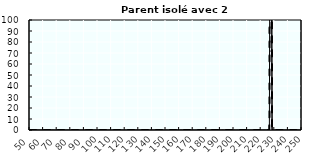
| Category | Coin fiscal marginal (somme des composantes) | Taux d’imposition marginal net |
|---|---|---|
| 50.0 | 0 | 0 |
| 51.0 | 0 | 0 |
| 52.0 | 0 | 0 |
| 53.0 | 0 | 0 |
| 54.0 | 0 | 0 |
| 55.0 | 0 | 0 |
| 56.0 | 0 | 0 |
| 57.0 | 0 | 0 |
| 58.0 | 0 | 0 |
| 59.0 | 0 | 0 |
| 60.0 | 0 | 0 |
| 61.0 | 0 | 0 |
| 62.0 | 0 | 0 |
| 63.0 | 0 | 0 |
| 64.0 | 0 | 0 |
| 65.0 | 0 | 0 |
| 66.0 | 0 | 0 |
| 67.0 | 0 | 0 |
| 68.0 | 0 | 0 |
| 69.0 | 0 | 0 |
| 70.0 | 0 | 0 |
| 71.0 | 0 | 0 |
| 72.0 | 0 | 0 |
| 73.0 | 0 | 0 |
| 74.0 | 0 | 0 |
| 75.0 | 0 | 0 |
| 76.0 | 0 | 0 |
| 77.0 | 0 | 0 |
| 78.0 | 0 | 0 |
| 79.0 | 0 | 0 |
| 80.0 | 0 | 0 |
| 81.0 | 0 | 0 |
| 82.0 | 0 | 0 |
| 83.0 | 0 | 0 |
| 84.0 | 0 | 0 |
| 85.0 | 0 | 0 |
| 86.0 | 0 | 0 |
| 87.0 | 0 | 0 |
| 88.0 | 0 | 0 |
| 89.0 | 0 | 0 |
| 90.0 | 0 | 0 |
| 91.0 | 0 | 0 |
| 92.0 | 0 | 0 |
| 93.0 | 0 | 0 |
| 94.0 | 0 | 0 |
| 95.0 | 0 | 0 |
| 96.0 | 0 | 0 |
| 97.0 | 0 | 0 |
| 98.0 | 0 | 0 |
| 99.0 | 0 | 0 |
| 100.0 | 0 | 0 |
| 101.0 | 0 | 0 |
| 102.0 | 0 | 0 |
| 103.0 | 0 | 0 |
| 104.0 | 0 | 0 |
| 105.0 | 0 | 0 |
| 106.0 | 0 | 0 |
| 107.0 | 0 | 0 |
| 108.0 | 0 | 0 |
| 109.0 | 0 | 0 |
| 110.0 | 0 | 0 |
| 111.0 | 0 | 0 |
| 112.0 | 0 | 0 |
| 113.0 | 0 | 0 |
| 114.0 | 0 | 0 |
| 115.0 | 0 | 0 |
| 116.0 | 0 | 0 |
| 117.0 | 0 | 0 |
| 118.0 | 0 | 0 |
| 119.0 | 0 | 0 |
| 120.0 | 0 | 0 |
| 121.0 | 0 | 0 |
| 122.0 | 0 | 0 |
| 123.0 | 0 | 0 |
| 124.0 | 0 | 0 |
| 125.0 | 0 | 0 |
| 126.0 | 0 | 0 |
| 127.0 | 0 | 0 |
| 128.0 | 0 | 0 |
| 129.0 | 0 | 0 |
| 130.0 | 0 | 0 |
| 131.0 | 0 | 0 |
| 132.0 | 0 | 0 |
| 133.0 | 0 | 0 |
| 134.0 | 0 | 0 |
| 135.0 | 0 | 0 |
| 136.0 | 0 | 0 |
| 137.0 | 0 | 0 |
| 138.0 | 0 | 0 |
| 139.0 | 0 | 0 |
| 140.0 | 0 | 0 |
| 141.0 | 0 | 0 |
| 142.0 | 0 | 0 |
| 143.0 | 0 | 0 |
| 144.0 | 0 | 0 |
| 145.0 | 0 | 0 |
| 146.0 | 0 | 0 |
| 147.0 | 0 | 0 |
| 148.0 | 0 | 0 |
| 149.0 | 0 | 0 |
| 150.0 | 0 | 0 |
| 151.0 | 0 | 0 |
| 152.0 | 0 | 0 |
| 153.0 | 0 | 0 |
| 154.0 | 0 | 0 |
| 155.0 | 0 | 0 |
| 156.0 | 0 | 0 |
| 157.0 | 0 | 0 |
| 158.0 | 0 | 0 |
| 159.0 | 0 | 0 |
| 160.0 | 0 | 0 |
| 161.0 | 0 | 0 |
| 162.0 | 0 | 0 |
| 163.0 | 0 | 0 |
| 164.0 | 0 | 0 |
| 165.0 | 0 | 0 |
| 166.0 | 0 | 0 |
| 167.0 | 0 | 0 |
| 168.0 | 0 | 0 |
| 169.0 | 0 | 0 |
| 170.0 | 0 | 0 |
| 171.0 | 0 | 0 |
| 172.0 | 0 | 0 |
| 173.0 | 0 | 0 |
| 174.0 | 0 | 0 |
| 175.0 | 0 | 0 |
| 176.0 | 0 | 0 |
| 177.0 | 0 | 0 |
| 178.0 | 0 | 0 |
| 179.0 | 0 | 0 |
| 180.0 | 0 | 0 |
| 181.0 | 0 | 0 |
| 182.0 | 0 | 0 |
| 183.0 | 0 | 0 |
| 184.0 | 0 | 0 |
| 185.0 | 0 | 0 |
| 186.0 | 0 | 0 |
| 187.0 | 0 | 0 |
| 188.0 | 0 | 0 |
| 189.0 | 0 | 0 |
| 190.0 | 0 | 0 |
| 191.0 | 0 | 0 |
| 192.0 | 0 | 0 |
| 193.0 | 0 | 0 |
| 194.0 | 0 | 0 |
| 195.0 | 0 | 0 |
| 196.0 | 0 | 0 |
| 197.0 | 0 | 0 |
| 198.0 | 0 | 0 |
| 199.0 | 0 | 0 |
| 200.0 | 0 | 0 |
| 201.0 | 0 | 0 |
| 202.0 | 0 | 0 |
| 203.0 | 0 | 0 |
| 204.0 | 0 | 0 |
| 205.0 | 0 | 0 |
| 206.0 | 0 | 0 |
| 207.0 | 0 | 0 |
| 208.0 | 0 | 0 |
| 209.0 | 0 | 0 |
| 210.0 | 0 | 0 |
| 211.0 | 0 | 0 |
| 212.0 | 0 | 0 |
| 213.0 | 0 | 0 |
| 214.0 | 0 | 0 |
| 215.0 | 0 | 0 |
| 216.0 | 0 | 0 |
| 217.0 | 0 | 0 |
| 218.0 | 0 | 0 |
| 219.0 | 0 | 0 |
| 220.0 | 0 | 0 |
| 221.0 | 0 | 0 |
| 222.0 | 0 | 0 |
| 223.0 | 0 | 0 |
| 224.0 | 0 | 0 |
| 225.0 | 0 | 0 |
| 226.0 | 0 | 0 |
| 227.0 | 479.717 | 479.717 |
| 228.0 | 0 | 0 |
| 229.0 | 0 | 0 |
| 230.0 | 0 | 0 |
| 231.0 | 0 | 0 |
| 232.0 | 0 | 0 |
| 233.0 | 0 | 0 |
| 234.0 | 0 | 0 |
| 235.0 | 0 | 0 |
| 236.0 | 0 | 0 |
| 237.0 | 0 | 0 |
| 238.0 | 0 | 0 |
| 239.0 | 0 | 0 |
| 240.0 | 0 | 0 |
| 241.0 | 0 | 0 |
| 242.0 | 0 | 0 |
| 243.0 | 0 | 0 |
| 244.0 | 0 | 0 |
| 245.0 | 0 | 0 |
| 246.0 | 0 | 0 |
| 247.0 | 0 | 0 |
| 248.0 | 0 | 0 |
| 249.0 | 0 | 0 |
| 250.0 | 0 | 0 |